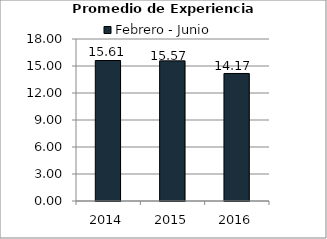
| Category | Febrero - Junio |
|---|---|
| 2014.0 | 15.61 |
| 2015.0 | 15.57 |
| 2016.0 | 14.17 |